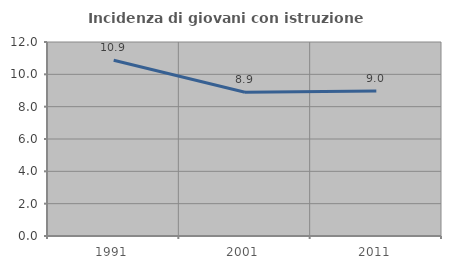
| Category | Incidenza di giovani con istruzione universitaria |
|---|---|
| 1991.0 | 10.87 |
| 2001.0 | 8.889 |
| 2011.0 | 8.974 |